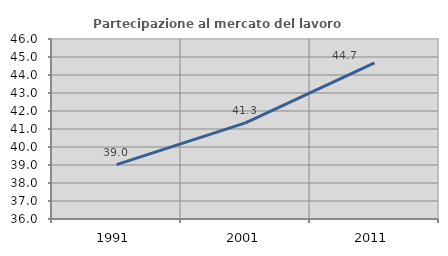
| Category | Partecipazione al mercato del lavoro  femminile |
|---|---|
| 1991.0 | 39.017 |
| 2001.0 | 41.339 |
| 2011.0 | 44.677 |